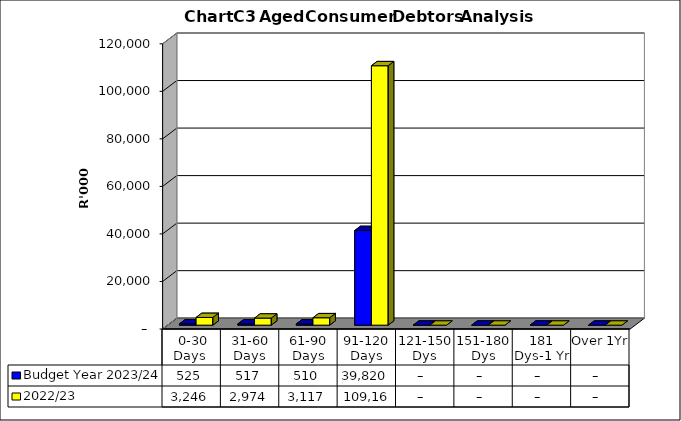
| Category | Budget Year 2023/24 | 2022/23 |
|---|---|---|
|  0-30 Days  | 524605 | 3245573 |
| 31-60 Days | 516780 | 2974092 |
| 61-90 Days | 510397 | 3117274 |
| 91-120 Days | 39819977 | 109161917 |
| 121-150 Dys | 0 | 0 |
| 151-180 Dys | 0 | 0 |
| 181 Dys-1 Yr | 0 | 0 |
| Over 1Yr | 0 | 0 |